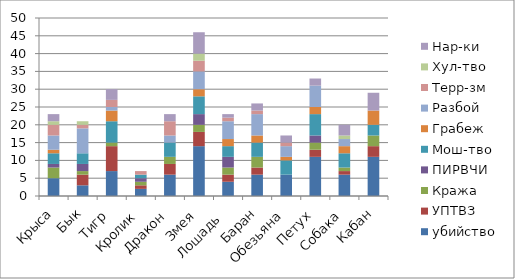
| Category | убийство | УПТВЗ | Кража | ПИРВЧИ | Мош-тво | Грабеж | Разбой | Терр-зм | Хул-тво | Нар-ки |
|---|---|---|---|---|---|---|---|---|---|---|
| Крыса | 5 | 0 | 3 | 1 | 3 | 1 | 4 | 3 | 1 | 2 |
| Бык | 3 | 3 | 1 | 2 | 3 | 0 | 7 | 1 | 1 | 0 |
| Тигр | 7 | 7 | 1 | 0 | 6 | 3 | 1 | 2 | 0 | 3 |
| Кролик | 2 | 1 | 1 | 1 | 1 | 0 | 0 | 1 | 0 | 0 |
| Дракон | 6 | 3 | 2 | 0 | 4 | 0 | 2 | 4 | 0 | 2 |
| Змея | 14 | 4 | 2 | 3 | 5 | 2 | 5 | 3 | 2 | 6 |
| Лошадь  | 4 | 2 | 2 | 3 | 3 | 2 | 5 | 1 | 0 | 1 |
| Баран | 6 | 2 | 3 | 0 | 4 | 2 | 6 | 1 | 0 | 2 |
| Обезьяна | 6 | 0 | 0 | 0 | 4 | 1 | 3 | 1 | 0 | 2 |
| Петух | 11 | 2 | 2 | 2 | 6 | 2 | 6 | 0 | 0 | 2 |
| Собака | 6 | 1 | 1 | 0 | 4 | 2 | 2 | 0 | 1 | 3 |
| Кабан | 11 | 3 | 3 | 0 | 3 | 4 | 0 | 0 | 0 | 5 |